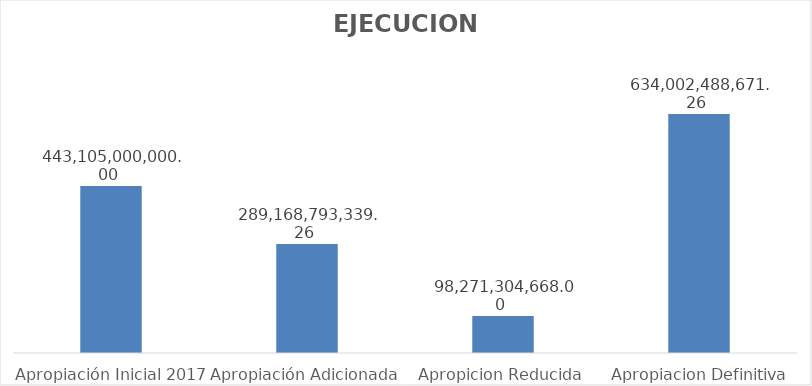
| Category | Series 0 |
|---|---|
| Apropiación Inicial 2017 | 443105000000 |
| Apropiación Adicionada | 289168793339.26 |
| Apropicion Reducida | 98271304668 |
| Apropiacion Definitiva 2017 | 634002488671.26 |